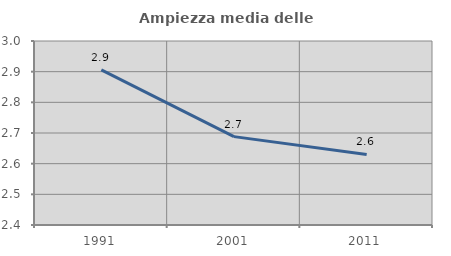
| Category | Ampiezza media delle famiglie |
|---|---|
| 1991.0 | 2.906 |
| 2001.0 | 2.688 |
| 2011.0 | 2.63 |